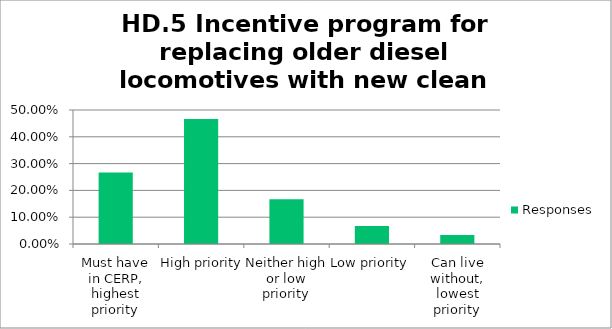
| Category | Responses |
|---|---|
| Must have in CERP, highest priority | 0.267 |
| High priority | 0.467 |
| Neither high or low priority | 0.167 |
| Low priority | 0.067 |
| Can live without, lowest priority | 0.033 |